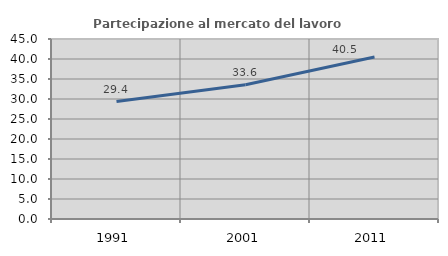
| Category | Partecipazione al mercato del lavoro  femminile |
|---|---|
| 1991.0 | 29.368 |
| 2001.0 | 33.566 |
| 2011.0 | 40.511 |